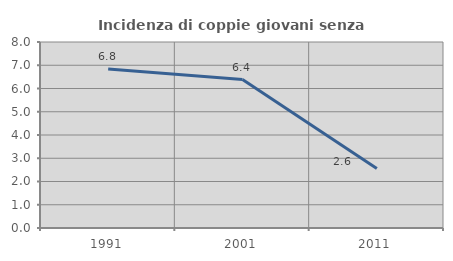
| Category | Incidenza di coppie giovani senza figli |
|---|---|
| 1991.0 | 6.838 |
| 2001.0 | 6.383 |
| 2011.0 | 2.564 |